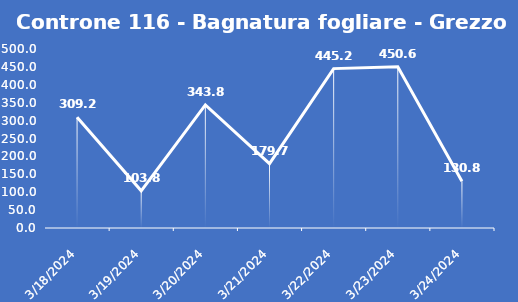
| Category | Controne 116 - Bagnatura fogliare - Grezzo (min) |
|---|---|
| 3/18/24 | 309.2 |
| 3/19/24 | 103.8 |
| 3/20/24 | 343.8 |
| 3/21/24 | 179.7 |
| 3/22/24 | 445.2 |
| 3/23/24 | 450.6 |
| 3/24/24 | 130.8 |